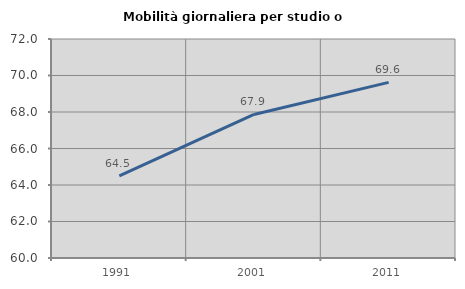
| Category | Mobilità giornaliera per studio o lavoro |
|---|---|
| 1991.0 | 64.495 |
| 2001.0 | 67.865 |
| 2011.0 | 69.625 |